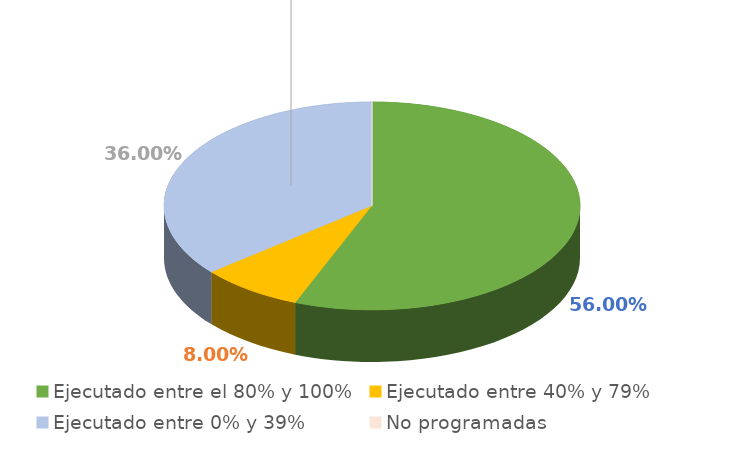
| Category | Series 0 |
|---|---|
| Ejecutado entre el 80% y 100% | 0.56 |
| Ejecutado entre 40% y 79% | 0.08 |
| Ejecutado entre 0% y 39% | 0.36 |
| No programadas | 0 |